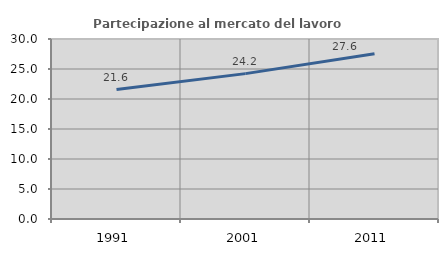
| Category | Partecipazione al mercato del lavoro  femminile |
|---|---|
| 1991.0 | 21.571 |
| 2001.0 | 24.228 |
| 2011.0 | 27.555 |